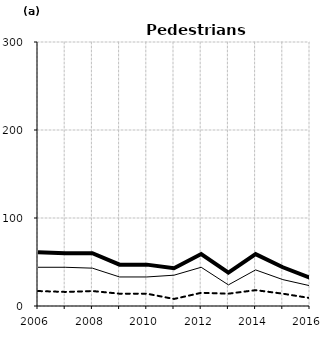
| Category | Built-up | Non built-up | Total |
|---|---|---|---|
| 2006.0 | 44 | 17 | 61 |
| 2007.0 | 44 | 16 | 60 |
| 2008.0 | 43 | 17 | 60 |
| 2009.0 | 33 | 14 | 47 |
| 2010.0 | 33 | 14 | 47 |
| 2011.0 | 35 | 8 | 43 |
| 2012.0 | 44 | 15 | 59 |
| 2013.0 | 24 | 14 | 38 |
| 2014.0 | 41 | 18 | 59 |
| 2015.0 | 30 | 14 | 44 |
| 2016.0 | 23 | 9 | 32 |